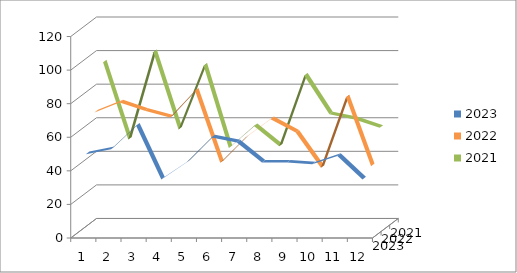
| Category | 2023 | 2022 | 2021 |
|---|---|---|---|
| 0 | 48 | 69 | 95 |
| 1 | 51 | 75 | 49 |
| 2 | 65 | 70 | 101 |
| 3 | 33 | 66 | 55 |
| 4 | 43 | 82 | 93 |
| 5 | 58 | 39 | 44 |
| 6 | 55 | 54 | 57 |
| 7 | 43 | 65 | 45 |
| 8 | 43 | 57 | 87 |
| 9 | 42 | 36 | 64 |
| 10 | 47 | 78 | 61 |
| 11 | 33 | 37 | 56 |